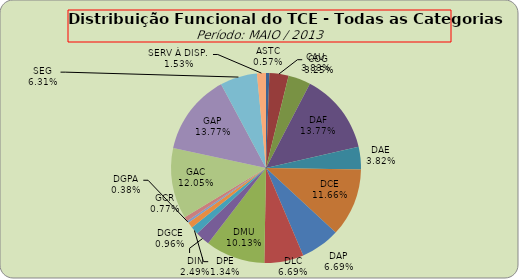
| Category | ASTC COG CAU DAF DAE DCE DAP DLC DMU DIN DPE DGCE DGPA GCR GAC GAP SEG SERV À DISP. |
|---|---|
| ASTC | 3 |
| COG | 17 |
| CAU | 20 |
| DAF | 72 |
| DAE | 20 |
| DCE | 61 |
| DAP | 35 |
| DLC | 35 |
| DMU | 53 |
| DIN | 13 |
| DPE | 7 |
| DGCE | 5 |
| DGPA | 2 |
| GCR | 4 |
| GAC | 63 |
| GAP | 72 |
| SEG | 33 |
| SERV À DISP. | 8 |